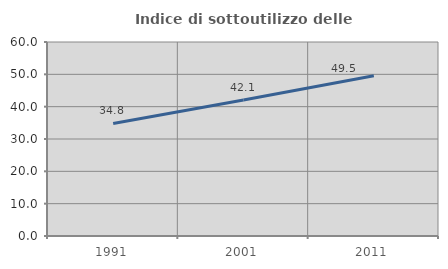
| Category | Indice di sottoutilizzo delle abitazioni  |
|---|---|
| 1991.0 | 34.809 |
| 2001.0 | 42.092 |
| 2011.0 | 49.534 |